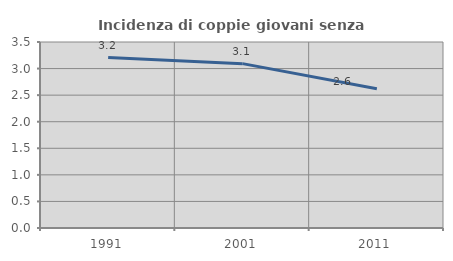
| Category | Incidenza di coppie giovani senza figli |
|---|---|
| 1991.0 | 3.206 |
| 2001.0 | 3.093 |
| 2011.0 | 2.619 |